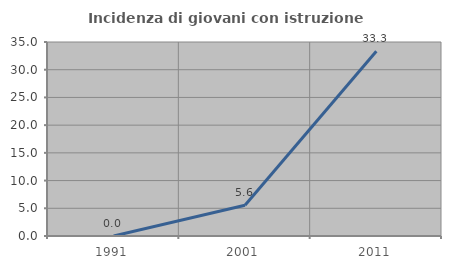
| Category | Incidenza di giovani con istruzione universitaria |
|---|---|
| 1991.0 | 0 |
| 2001.0 | 5.556 |
| 2011.0 | 33.333 |